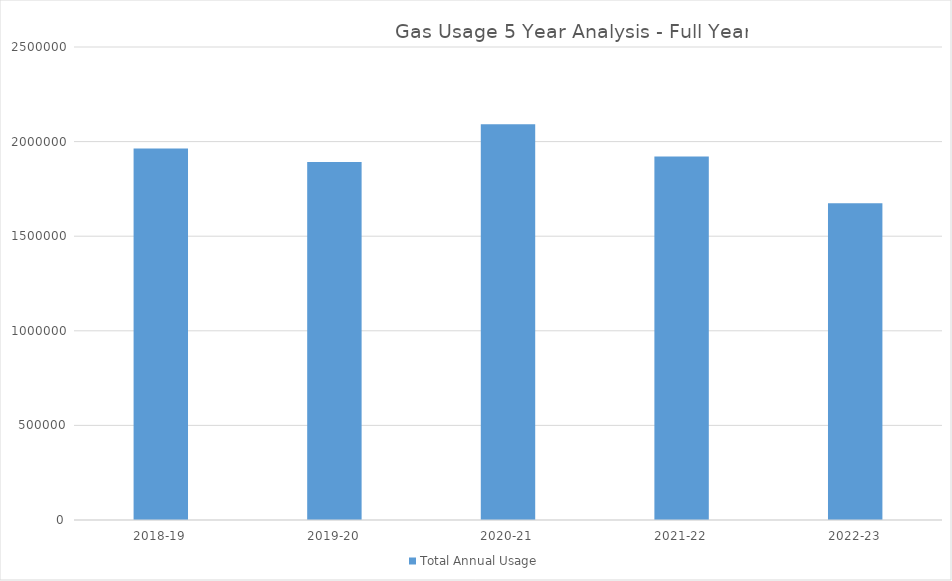
| Category | Total Annual Usage |
|---|---|
| 2018-19 | 1963014 |
| 2019-20 | 1892334 |
| 2020-21 | 2091268 |
| 2021-22 | 1920711 |
| 2022-23 | 1674577 |